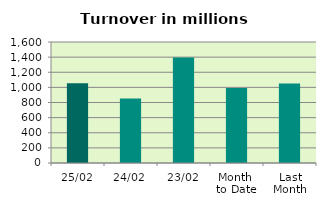
| Category | Series 0 |
|---|---|
| 25/02 | 1052.944 |
| 24/02 | 853.02 |
| 23/02 | 1396.12 |
| Month 
to Date | 990.637 |
| Last
Month | 1049.647 |